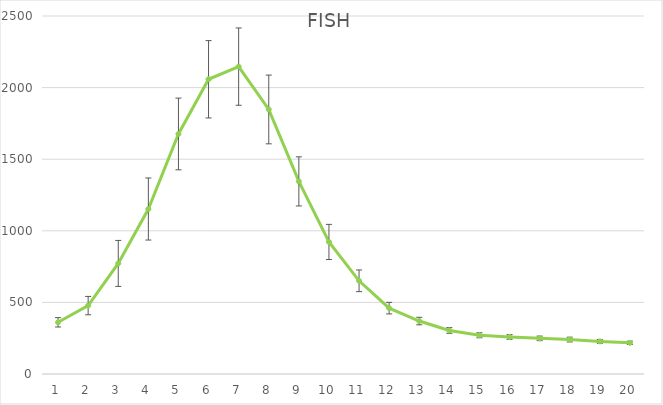
| Category | FISH |
|---|---|
| 0 | 360.961 |
| 1 | 477.666 |
| 2 | 772.182 |
| 3 | 1152.194 |
| 4 | 1676.204 |
| 5 | 2058.059 |
| 6 | 2146.561 |
| 7 | 1847.311 |
| 8 | 1344.962 |
| 9 | 922.114 |
| 10 | 650.776 |
| 11 | 459.919 |
| 12 | 369.718 |
| 13 | 303.941 |
| 14 | 270.653 |
| 15 | 258.746 |
| 16 | 248.915 |
| 17 | 240.417 |
| 18 | 227.742 |
| 19 | 218.006 |